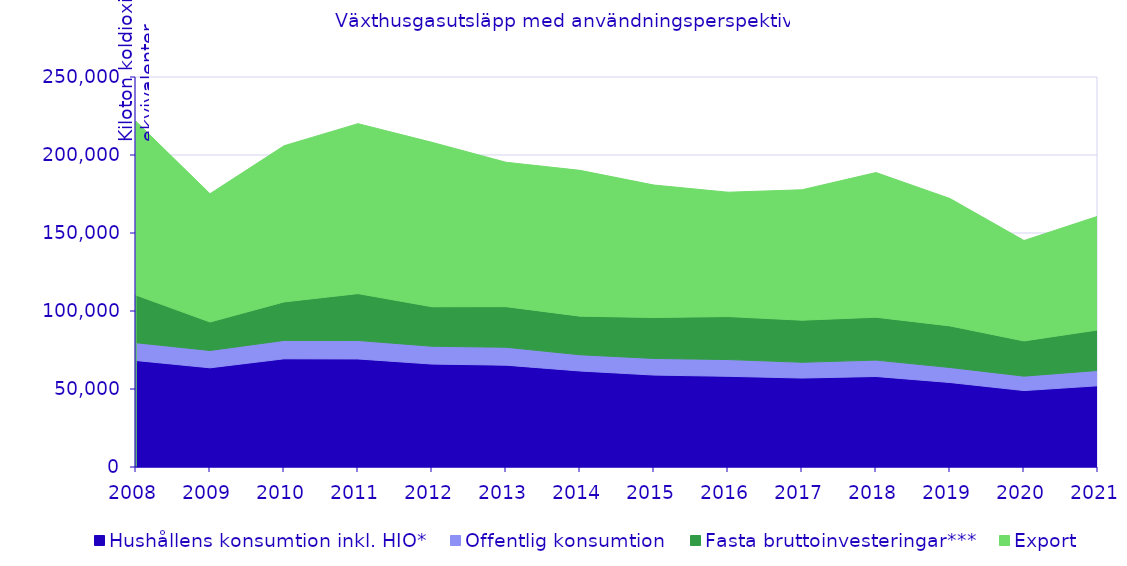
| Category | Hushållens konsumtion inkl. HIO* | Offentlig konsumtion | Fasta bruttoinvesteringar*** | Export |
|---|---|---|---|---|
| 2008.0 | 68254.175 | 11420.005 | 30510.038 | 111358.385 |
| 2009.0 | 63580.285 | 11094.035 | 18272.982 | 82204.734 |
| 2010.0 | 69359.96 | 11769.559 | 24693.731 | 100094.575 |
| 2011.0 | 69268.454 | 11837.572 | 30036.097 | 108953.392 |
| 2012.0 | 65977.651 | 11417.841 | 25320.17 | 105381.445 |
| 2013.0 | 65276.866 | 11474.72 | 26037.875 | 92562.114 |
| 2014.0 | 61540.033 | 10405.401 | 24747.847 | 93458.786 |
| 2015.0 | 58932.844 | 10643.783 | 26256.03 | 84900.017 |
| 2016.0 | 58140.044 | 10746.49 | 27544.695 | 79712.403 |
| 2017.0 | 57017.663 | 10127.729 | 26967.552 | 83595.089 |
| 2018.0 | 58013.632 | 10498.266 | 27484.875 | 92749.051 |
| 2019.0 | 54160.855 | 9616.703 | 26671.748 | 81638.098 |
| 2020.0 | 48987.976 | 9259.65 | 22565.244 | 64365.32 |
| 2021.0 | 52064.529 | 9822.15 | 25993.151 | 72908.953 |